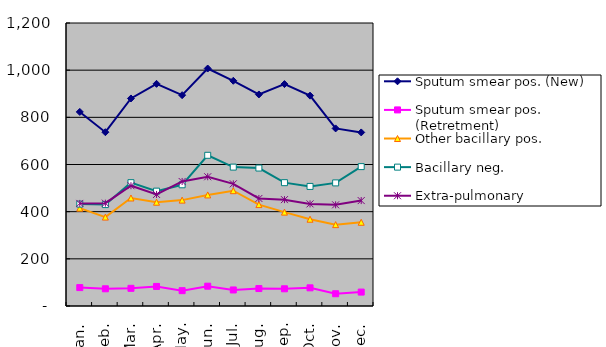
| Category | Sputum smear pos. (New) | Sputum smear pos. (Retretment) | Other bacillary pos. | Bacillary neg. | Extra-pulmonary |
|---|---|---|---|---|---|
| Jan. | 823 | 78 | 415 | 432 | 435 |
| Feb. | 737 | 73 | 377 | 430 | 436 |
| Mar. | 880 | 75 | 458 | 523 | 510 |
| Apr. | 942 | 83 | 440 | 487 | 473 |
| May. | 894 | 65 | 449 | 514 | 528 |
| Jun. | 1007 | 84 | 471 | 639 | 548 |
| Jul. | 955 | 68 | 489 | 589 | 518 |
| Aug. | 897 | 74 | 430 | 585 | 456 |
| Sep. | 941 | 73 | 398 | 523 | 451 |
| Oct. | 892 | 77 | 368 | 507 | 433 |
| Nov. | 753 | 52 | 345 | 522 | 429 |
| Dec. | 736 | 59 | 355 | 591 | 447 |